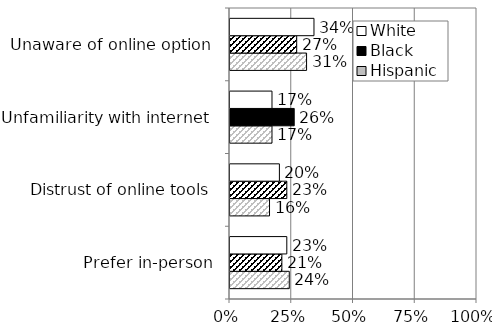
| Category | Hispanic | Black | White |
|---|---|---|---|
| Prefer in-person | 0.24 | 0.21 | 0.23 |
| Distrust of online tools | 0.16 | 0.23 | 0.2 |
| Unfamiliarity with internet | 0.17 | 0.26 | 0.17 |
| Unaware of online option | 0.31 | 0.27 | 0.34 |